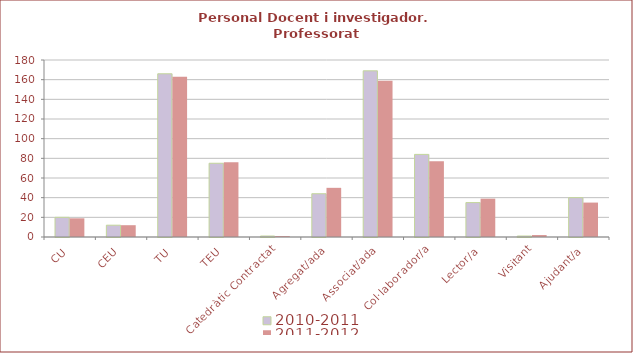
| Category | 2010-2011 | 2011-2012 |
|---|---|---|
| CU | 20 | 19 |
| CEU | 12 | 12 |
| TU | 166 | 163 |
| TEU | 75 | 76 |
| Catedràtic Contractat | 1 | 1 |
| Agregat/ada | 44 | 50 |
| Associat/ada | 169 | 159 |
| Col·laborador/a | 84 | 77 |
| Lector/a | 35 | 39 |
| Visitant | 1 | 2 |
| Ajudant/a | 40 | 35 |